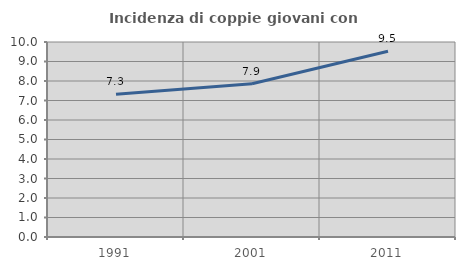
| Category | Incidenza di coppie giovani con figli |
|---|---|
| 1991.0 | 7.317 |
| 2001.0 | 7.857 |
| 2011.0 | 9.524 |